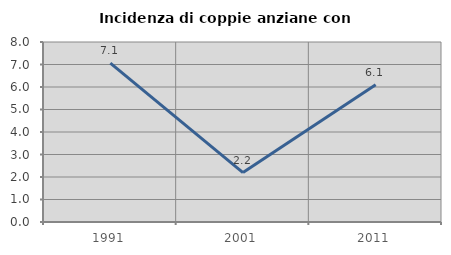
| Category | Incidenza di coppie anziane con figli |
|---|---|
| 1991.0 | 7.059 |
| 2001.0 | 2.198 |
| 2011.0 | 6.098 |